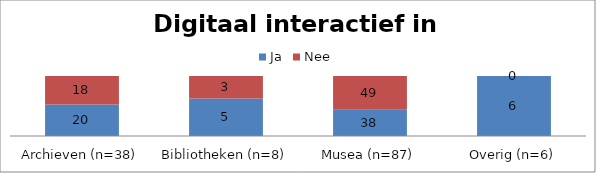
| Category | Ja | Nee |
|---|---|---|
| Archieven (n=38) | 20 | 18 |
| Bibliotheken (n=8) | 5 | 3 |
| Musea (n=87) | 38 | 49 |
| Overig (n=6) | 6 | 0 |